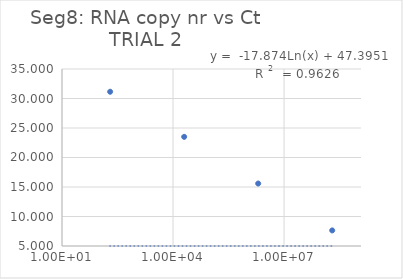
| Category | Series 0 |
|---|---|
| 200000000.0 | 7.643 |
| 2000000.0 | 15.589 |
| 20000.0 | 23.503 |
| 200.0 | 31.146 |